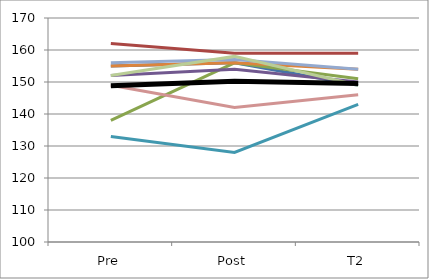
| Category | Series 0 | Series 1 | Series 2 | Series 3 | Series 4 | Series 5 | Series 6 | Series 7 | Series 8 | Mean |
|---|---|---|---|---|---|---|---|---|---|---|
| Pre | 155 | 162 | 138 | 152 | 133 | 155 | 156 | 149 | 152 | 148.8 |
| Post | 156 | 159 | 156 | 154 | 128 | 156 | 157 | 142 | 158 | 150.2 |
| T2 | 149 | 159 | 151 | 150 | 143 | 154 | 154 | 146 | 149 | 149.5 |